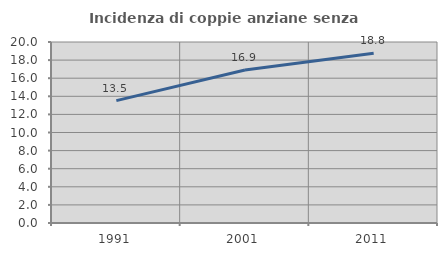
| Category | Incidenza di coppie anziane senza figli  |
|---|---|
| 1991.0 | 13.527 |
| 2001.0 | 16.904 |
| 2011.0 | 18.759 |